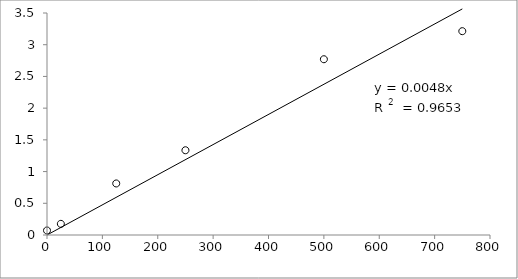
| Category | Series 0 |
|---|---|
| 750.0 | 3.214 |
| 500.0 | 2.771 |
| 250.0 | 1.336 |
| 125.0 | 0.812 |
| 25.0 | 0.176 |
| 0.0 | 0.072 |